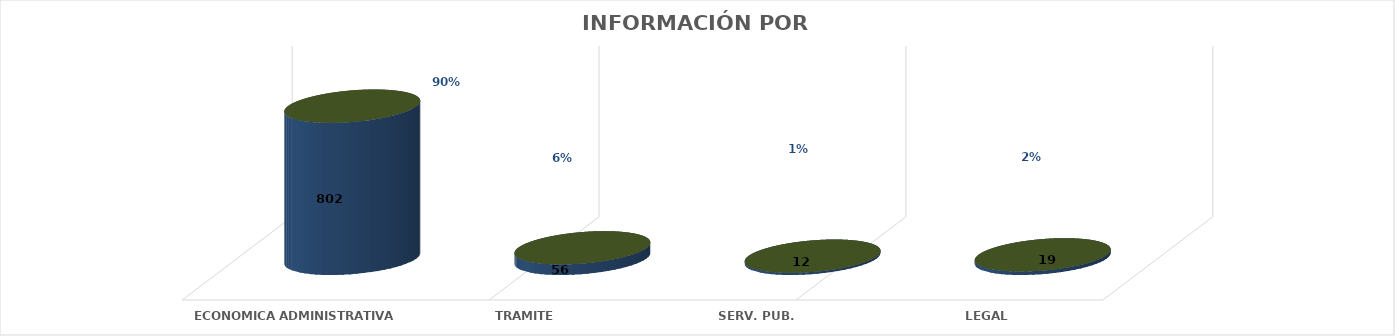
| Category | Series 0 | Series 1 | Series 2 | Series 3 | Series 4 |
|---|---|---|---|---|---|
| ECONOMICA ADMINISTRATIVA |  |  |  | 802 | 0.902 |
| TRAMITE |  |  |  | 56 | 0.063 |
| SERV. PUB. |  |  |  | 12 | 0.013 |
| LEGAL |  |  |  | 19 | 0.021 |